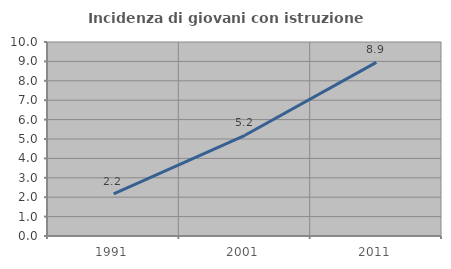
| Category | Incidenza di giovani con istruzione universitaria |
|---|---|
| 1991.0 | 2.174 |
| 2001.0 | 5.19 |
| 2011.0 | 8.947 |